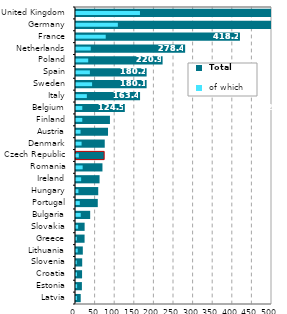
| Category |  Total |
|---|---|
| Latvia | 12.016 |
| Estonia | 15.058 |
| Croatia | 15.493 |
| Slovenia | 15.835 |
| Lithuania | 17.388 |
| Greece | 21.89 |
| Slovakia | 22.002 |
| Bulgaria | 36.182 |
| Portugal | 55.563 |
| Hungary | 56.722 |
| Ireland | 60.131 |
| Romania | 67.503 |
| Czech Republic | 71.858 |
| Denmark | 73.334 |
| Austria | 81.677 |
| Finland | 86.621 |
| Belgium | 124.544 |
| Italy | 163.429 |
| Sweden | 180.148 |
| Spain | 180.178 |
| Poland | 220.901 |
| Netherlands | 278.448 |
| France | 418.221 |
| Germany | 779.216 |
| United Kingdom | 928.883 |